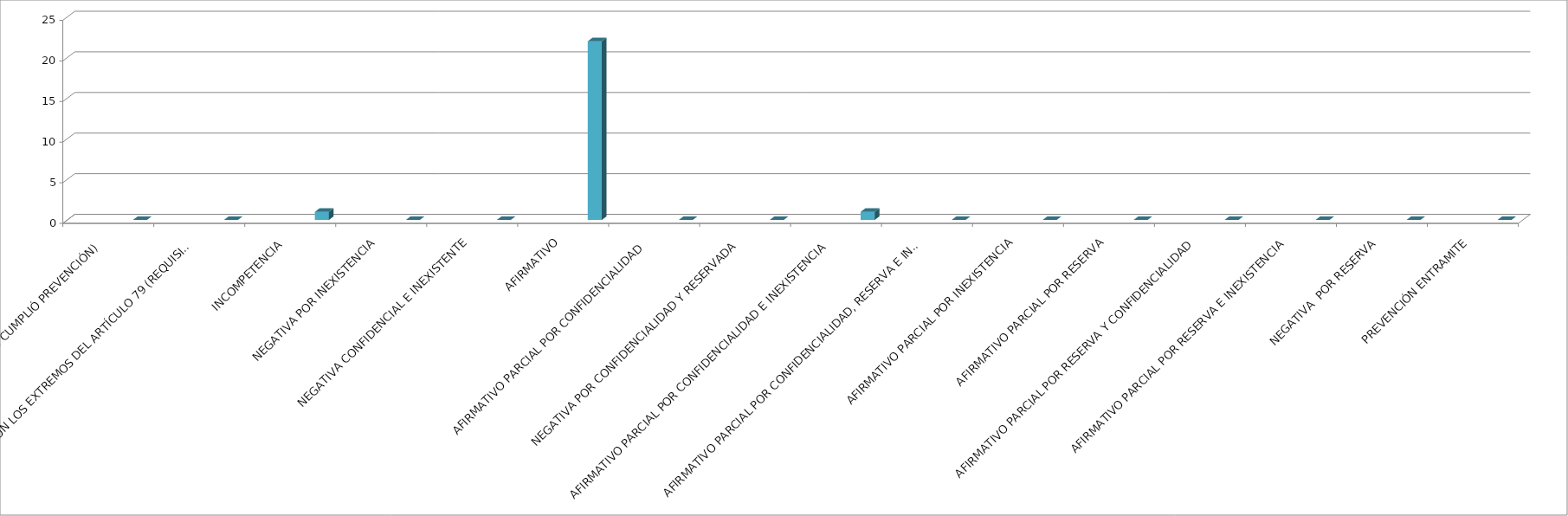
| Category | Series 0 | Series 1 | Series 2 | Series 3 | Series 4 |
|---|---|---|---|---|---|
| SE TIENE POR NO PRESENTADA ( NO CUMPLIÓ PREVENCIÓN) |  |  |  |  | 0 |
| NO CUMPLIO CON LOS EXTREMOS DEL ARTÍCULO 79 (REQUISITOS) |  |  |  |  | 0 |
| INCOMPETENCIA  |  |  |  |  | 1 |
| NEGATIVA POR INEXISTENCIA |  |  |  |  | 0 |
| NEGATIVA CONFIDENCIAL E INEXISTENTE |  |  |  |  | 0 |
| AFIRMATIVO |  |  |  |  | 22 |
| AFIRMATIVO PARCIAL POR CONFIDENCIALIDAD  |  |  |  |  | 0 |
| NEGATIVA POR CONFIDENCIALIDAD Y RESERVADA |  |  |  |  | 0 |
| AFIRMATIVO PARCIAL POR CONFIDENCIALIDAD E INEXISTENCIA |  |  |  |  | 1 |
| AFIRMATIVO PARCIAL POR CONFIDENCIALIDAD, RESERVA E INEXISTENCIA |  |  |  |  | 0 |
| AFIRMATIVO PARCIAL POR INEXISTENCIA |  |  |  |  | 0 |
| AFIRMATIVO PARCIAL POR RESERVA |  |  |  |  | 0 |
| AFIRMATIVO PARCIAL POR RESERVA Y CONFIDENCIALIDAD |  |  |  |  | 0 |
| AFIRMATIVO PARCIAL POR RESERVA E INEXISTENCIA |  |  |  |  | 0 |
| NEGATIVA  POR RESERVA |  |  |  |  | 0 |
| PREVENCIÓN ENTRAMITE |  |  |  |  | 0 |